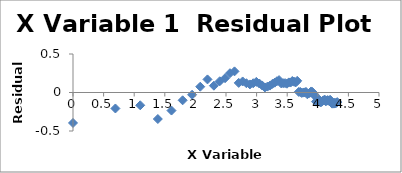
| Category | Series 0 |
|---|---|
| 0.0 | -0.396 |
| 0.6931471805599453 | -0.208 |
| 1.0986122886681098 | -0.166 |
| 1.3862943611198906 | -0.344 |
| 1.6094379124341003 | -0.234 |
| 1.791759469228055 | -0.101 |
| 1.9459101490553132 | -0.029 |
| 2.0794415416798357 | 0.075 |
| 2.1972245773362196 | 0.17 |
| 2.302585092994046 | 0.088 |
| 2.3978952727983707 | 0.146 |
| 2.4849066497880004 | 0.186 |
| 2.5649493574615367 | 0.251 |
| 2.6390573296152584 | 0.275 |
| 2.70805020110221 | 0.125 |
| 2.772588722239781 | 0.143 |
| 2.833213344056216 | 0.121 |
| 2.8903717578961645 | 0.105 |
| 2.9444389791664403 | 0.12 |
| 2.995732273553991 | 0.138 |
| 3.044522437723423 | 0.117 |
| 3.091042453358316 | 0.091 |
| 3.1354942159291497 | 0.065 |
| 3.1780538303479458 | 0.077 |
| 3.2188758248682006 | 0.09 |
| 3.258096538021482 | 0.112 |
| 3.295836866004329 | 0.127 |
| 3.332204510175204 | 0.146 |
| 3.367295829986474 | 0.161 |
| 3.4011973816621555 | 0.119 |
| 3.4339872044851463 | 0.121 |
| 3.4657359027997265 | 0.122 |
| 3.4965075614664802 | 0.114 |
| 3.5263605246161616 | 0.131 |
| 3.5553480614894135 | 0.129 |
| 3.58351893845611 | 0.149 |
| 3.6109179126442243 | 0.14 |
| 3.6375861597263857 | 0.131 |
| 3.6635616461296463 | 0.152 |
| 3.6888794541139363 | 0.007 |
| 3.713572066704308 | 0.007 |
| 3.7376696182833684 | -0.006 |
| 3.7612001156935624 | -0.001 |
| 3.784189633918261 | 0.002 |
| 3.8066624897703196 | 0.007 |
| 3.828641396489095 | -0.023 |
| 3.8501476017100584 | -0.013 |
| 3.871201010907891 | -0.002 |
| 3.8918202981106265 | 0.014 |
| 3.912023005428146 | 0.006 |
| 3.9318256327243257 | -0.029 |
| 3.9512437185814275 | -0.034 |
| 3.970291913552122 | -0.118 |
| 3.9889840465642745 | -0.11 |
| 4.007333185232471 | -0.099 |
| 4.02535169073515 | -0.095 |
| 4.04305126783455 | -0.128 |
| 4.060443010546419 | -0.122 |
| 4.07753744390572 | -0.108 |
| 4.0943445622221 | -0.104 |
| 4.110873864173311 | -0.092 |
| 4.127134385045092 | -0.113 |
| 4.143134726391533 | -0.109 |
| 4.1588830833596715 | -0.099 |
| 4.174387269895637 | -0.107 |
| 4.189654742026425 | -0.1 |
| 4.204692619390966 | -0.096 |
| 4.219507705176107 | -0.131 |
| 4.23410650459726 | -0.145 |
| 4.248495242049359 | -0.14 |
| 4.2626798770413155 | -0.144 |
| 4.276666119016055 | -0.134 |
| 4.290459441148391 | -0.139 |
| 4.30406509320417 | -0.134 |
| 4.31748811353631 | -0.124 |